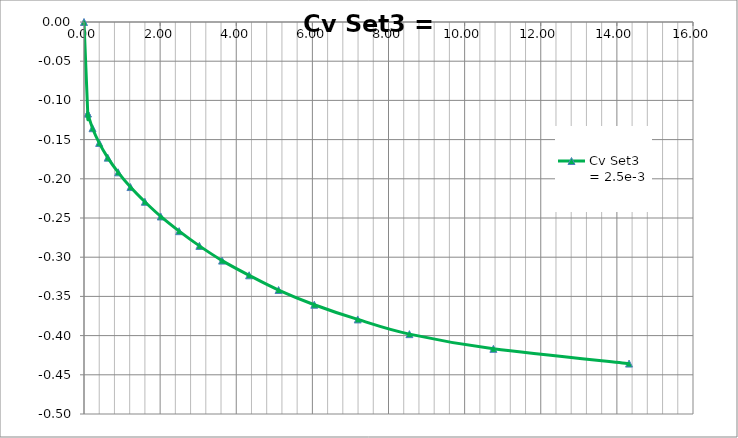
| Category | Cv Set3 = 2.5e-3 |
|---|---|
| 0.0 | 0 |
| 0.09893455098934552 | -0.117 |
| 0.09893455098934552 | -0.117 |
| 0.22450532724505326 | -0.135 |
| 0.3982749873160832 | -0.154 |
| 0.6227803145611365 | -0.173 |
| 0.8967529173008626 | -0.192 |
| 1.2201927955352614 | -0.211 |
| 1.5981735159817352 | -0.229 |
| 2.0167427701674274 | -0.248 |
| 2.4987316083206497 | -0.267 |
| 3.0314561136478946 | -0.286 |
| 3.627600202942669 | -0.304 |
| 4.337899543378995 | -0.323 |
| 5.111618467782851 | -0.342 |
| 6.050228310502283 | -0.361 |
| 7.191780821917808 | -0.379 |
| 8.548959918822932 | -0.398 |
| 10.755961440892948 | -0.417 |
| 14.320142059868088 | -0.436 |